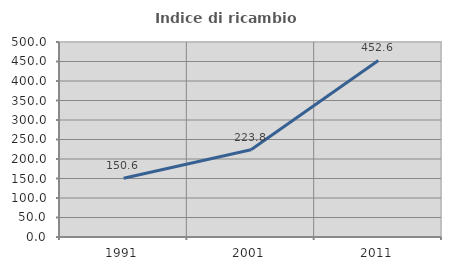
| Category | Indice di ricambio occupazionale  |
|---|---|
| 1991.0 | 150.636 |
| 2001.0 | 223.843 |
| 2011.0 | 452.613 |